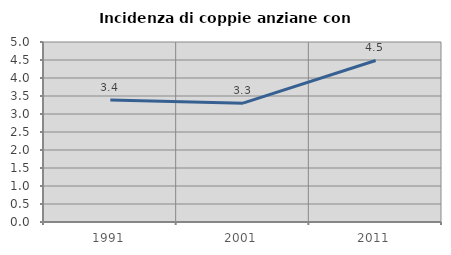
| Category | Incidenza di coppie anziane con figli |
|---|---|
| 1991.0 | 3.387 |
| 2001.0 | 3.301 |
| 2011.0 | 4.487 |